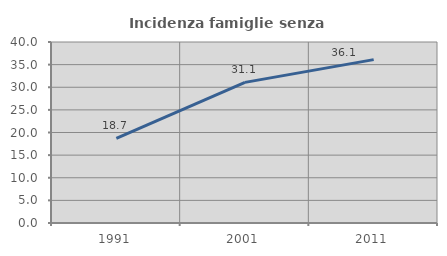
| Category | Incidenza famiglie senza nuclei |
|---|---|
| 1991.0 | 18.697 |
| 2001.0 | 31.078 |
| 2011.0 | 36.101 |